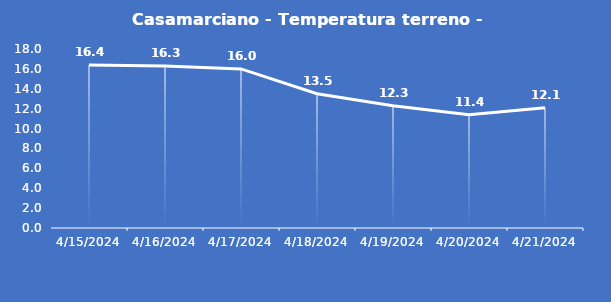
| Category | Casamarciano - Temperatura terreno - Grezzo (°C) |
|---|---|
| 4/15/24 | 16.4 |
| 4/16/24 | 16.3 |
| 4/17/24 | 16 |
| 4/18/24 | 13.5 |
| 4/19/24 | 12.3 |
| 4/20/24 | 11.4 |
| 4/21/24 | 12.1 |